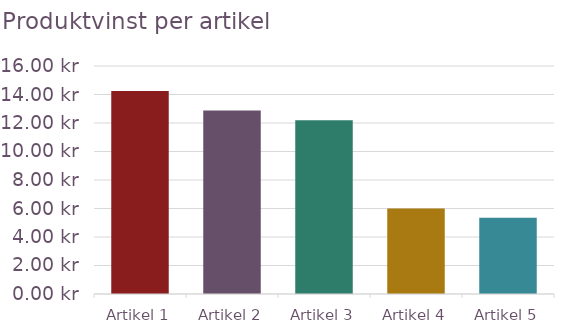
| Category | Vinst per artikel 
(inkl. frakt) |
|---|---|
| Artikel 1 | 14.25 |
| Artikel 2 | 12.875 |
| Artikel 3 | 12.2 |
| Artikel 4 | 6 |
| Artikel 5 | 5.35 |